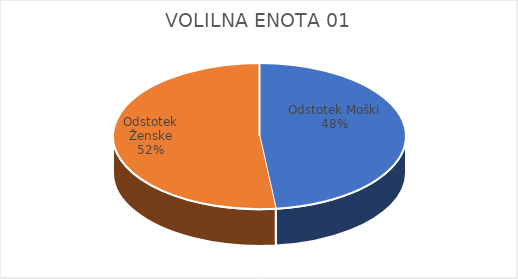
| Category | VOLILNA ENOTA 01 |
|---|---|
| Odstotek Moški | 14.58 |
| Odstotek Ženske | 15.65 |